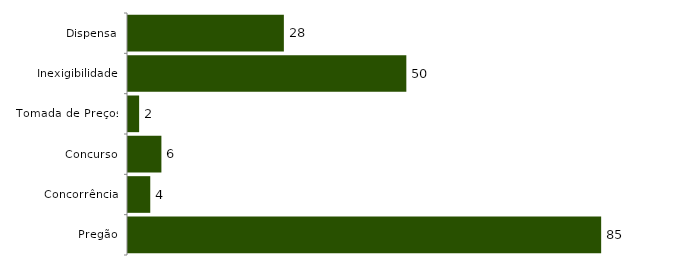
| Category | Series 0 |
|---|---|
| Pregão | 85 |
| Concorrência | 4 |
| Concurso | 6 |
| Tomada de Preços | 2 |
| Inexigibilidade | 50 |
| Dispensa | 28 |